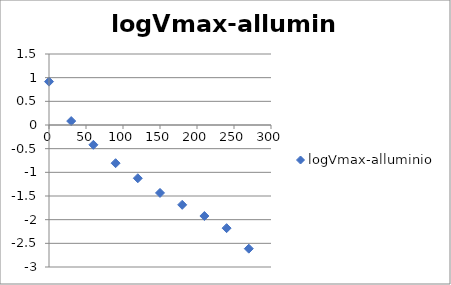
| Category | logVmax-alluminio |
|---|---|
| 0.0 | 0.916 |
| 30.0 | 0.083 |
| 60.0 | -0.419 |
| 90.0 | -0.806 |
| 120.0 | -1.125 |
| 150.0 | -1.435 |
| 180.0 | -1.686 |
| 210.0 | -1.923 |
| 240.0 | -2.179 |
| 270.0 | -2.613 |